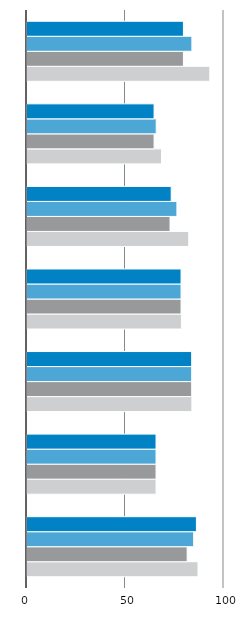
| Category | Summe von Maximum | Summe von Minimum | Summe von Deutschland | Summe von Anteil an den Beschäftigten insg. In % VZÄ |
|---|---|---|---|---|
| 7 | 86.8 | 81.3 | 84.6 | 86 |
| 6 | 65.5 | 65.5 | 65.5 | 65.5 |
| 5 | 83.7 | 83.6 | 83.6 | 83.6 |
| 4 | 78.4 | 78.2 | 78.2 | 78.2 |
| 3 | 82.1 | 72.6 | 76.1 | 73.2 |
| 2 | 68.3 | 64.5 | 65.6 | 64.5 |
| 1 | 92.8 | 79.4 | 83.7 | 79.4 |